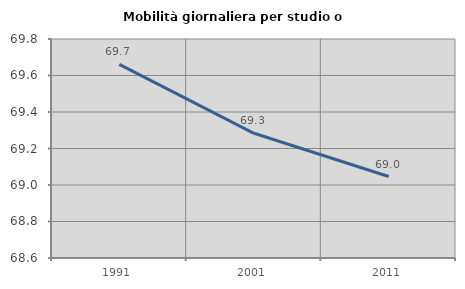
| Category | Mobilità giornaliera per studio o lavoro |
|---|---|
| 1991.0 | 69.661 |
| 2001.0 | 69.283 |
| 2011.0 | 69.046 |